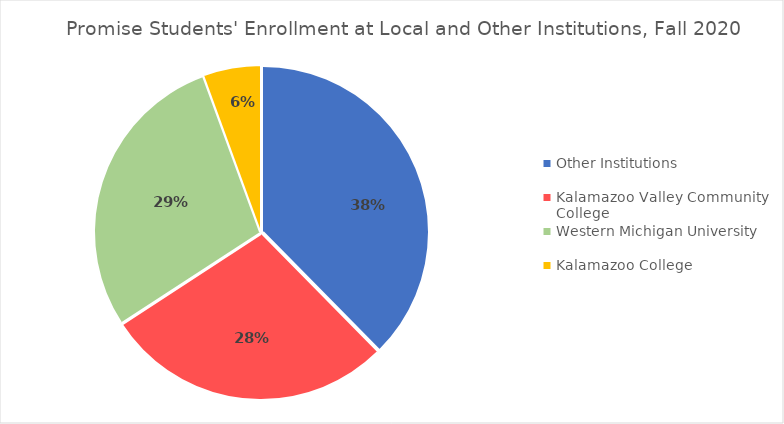
| Category | Series 1 |
|---|---|
| Other Institutions | 0.376 |
| Kalamazoo Valley Community College | 0.282 |
| Western Michigan University | 0.286 |
| Kalamazoo College | 0.056 |